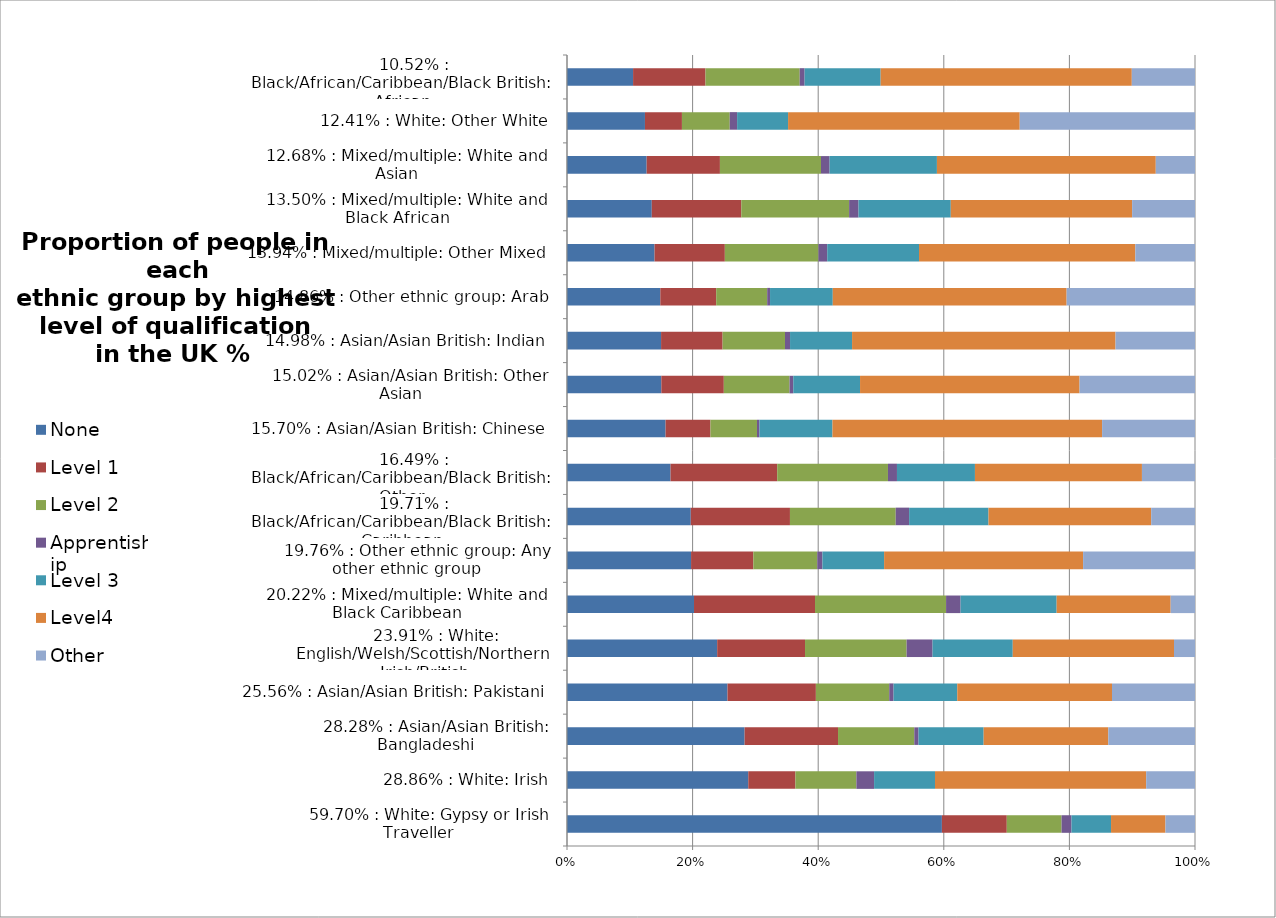
| Category | None | Level 1 | Level 2 | Apprentiship | Level 3 | Level4 | Other |
|---|---|---|---|---|---|---|---|
|      59.70% : White: Gypsy or Irish Traveller | 0.597 | 0.103 | 0.087 | 0.016 | 0.063 | 0.087 | 0.047 |
|      28.86% : White: Irish | 0.289 | 0.075 | 0.097 | 0.028 | 0.097 | 0.336 | 0.078 |
|      28.28% : Asian/Asian British: Bangladeshi | 0.283 | 0.149 | 0.121 | 0.007 | 0.104 | 0.198 | 0.138 |
|      25.56% : Asian/Asian British: Pakistani | 0.256 | 0.141 | 0.117 | 0.007 | 0.101 | 0.246 | 0.132 |
|      23.91% : White: English/Welsh/Scottish/Northern Irish/British | 0.239 | 0.14 | 0.162 | 0.041 | 0.128 | 0.257 | 0.033 |
|      20.22% : Mixed/multiple: White and Black Caribbean | 0.202 | 0.193 | 0.209 | 0.023 | 0.153 | 0.182 | 0.039 |
|      19.76% : Other ethnic group: Any other ethnic group | 0.198 | 0.099 | 0.102 | 0.008 | 0.098 | 0.317 | 0.178 |
|      19.71% : Black/African/Caribbean/Black British: Caribbean | 0.197 | 0.158 | 0.168 | 0.021 | 0.126 | 0.259 | 0.07 |
|      16.49% : Black/African/Caribbean/Black British: Other | 0.165 | 0.17 | 0.176 | 0.014 | 0.124 | 0.266 | 0.084 |
|      15.70% : Asian/Asian British: Chinese | 0.157 | 0.071 | 0.074 | 0.004 | 0.116 | 0.429 | 0.148 |
|      15.02% : Asian/Asian British: Other Asian | 0.15 | 0.1 | 0.105 | 0.006 | 0.106 | 0.35 | 0.184 |
|      14.98% : Asian/Asian British: Indian | 0.15 | 0.098 | 0.099 | 0.008 | 0.099 | 0.42 | 0.127 |
|      14.86% : Other ethnic group: Arab | 0.149 | 0.089 | 0.081 | 0.005 | 0.1 | 0.372 | 0.204 |
|      13.94% : Mixed/multiple: Other Mixed | 0.139 | 0.112 | 0.149 | 0.014 | 0.146 | 0.344 | 0.095 |
|      13.50% : Mixed/multiple: White and Black African | 0.135 | 0.143 | 0.172 | 0.015 | 0.147 | 0.289 | 0.1 |
|      12.68% : Mixed/multiple: White and Asian | 0.127 | 0.117 | 0.161 | 0.014 | 0.171 | 0.348 | 0.062 |
|      12.41% : White: Other White | 0.124 | 0.059 | 0.076 | 0.012 | 0.081 | 0.369 | 0.279 |
|      10.52% : Black/African/Caribbean/Black British: African | 0.105 | 0.115 | 0.15 | 0.008 | 0.121 | 0.4 | 0.101 |